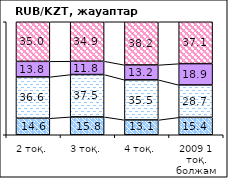
| Category | жоғарылайды | өзгермейді | төмендейді | білмеймін |
|---|---|---|---|---|
| 2 тоқ. | 14.59 | 36.63 | 13.75 | 35.03 |
| 3 тоқ. | 15.84 | 37.45 | 11.8 | 34.91 |
| 4 тоқ.  | 13.12 | 35.5 | 13.18 | 38.21 |
| 2009 1 тоқ. болжам | 15.41 | 28.66 | 18.88 | 37.05 |